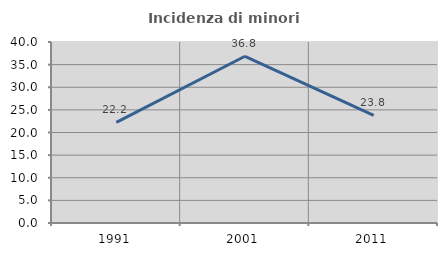
| Category | Incidenza di minori stranieri |
|---|---|
| 1991.0 | 22.222 |
| 2001.0 | 36.842 |
| 2011.0 | 23.81 |